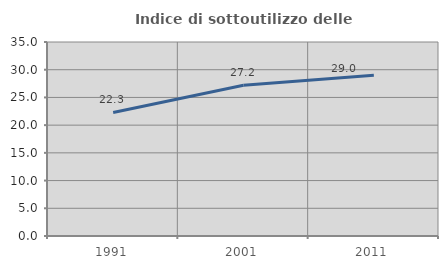
| Category | Indice di sottoutilizzo delle abitazioni  |
|---|---|
| 1991.0 | 22.291 |
| 2001.0 | 27.202 |
| 2011.0 | 29.011 |